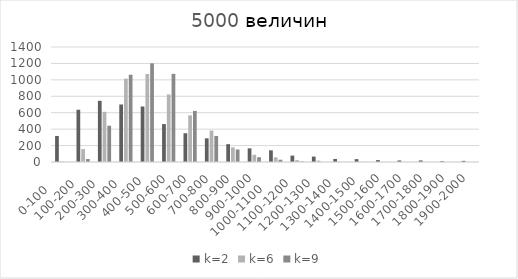
| Category | k=2 | k=6 | k=9 |
|---|---|---|---|
| 0-100     | 317 | 6 | 1 |
| 100-200   | 636 | 157 | 36 |
| 200-300   | 745 | 611 | 442 |
| 300-400   | 700 | 1015 | 1063 |
| 400-500  | 676 | 1071 | 1201 |
| 500-600 | 462 | 822 | 1073 |
| 600-700 | 350 | 568 | 622 |
| 700-800 | 288 | 383 | 317 |
| 800-900 | 217 | 178 | 152 |
| 900-1000 | 166 | 88 | 58 |
| 1000-1100     | 142 | 57 | 28 |
| 1100-1200   | 78 | 23 | 6 |
| 1200-1300   | 66 | 17 | 0 |
| 1300-1400   | 37 | 2 | 1 |
| 1400-1500  | 35 | 1 | 0 |
| 1500-1600 | 23 | 1 | 0 |
| 1600-1700 | 19 | 0 | 0 |
| 1700-1800 | 19 | 0 | 0 |
| 1800-1900 | 10 | 0 | 0 |
| 1900-2000 | 14 | 0 | 0 |